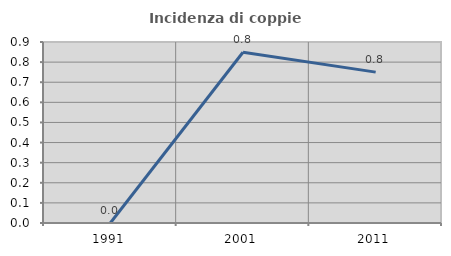
| Category | Incidenza di coppie miste |
|---|---|
| 1991.0 | 0 |
| 2001.0 | 0.849 |
| 2011.0 | 0.75 |